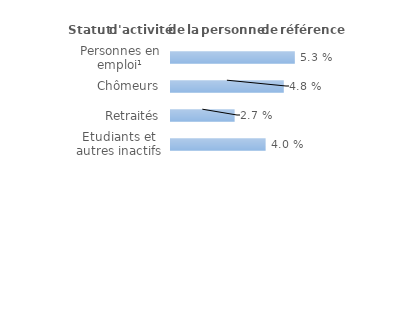
| Category | Series 0 |
|---|---|
| Personnes en emploi¹ | 0.053 |
| Chômeurs | 0.048 |
| Retraités | 0.027 |
| Etudiants et autres inactifs | 0.04 |